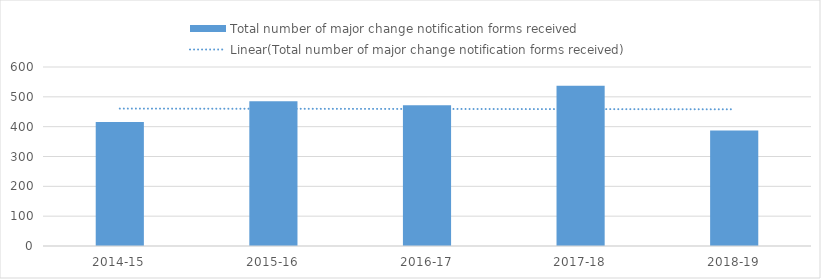
| Category | Total number of major change notification forms received |
|---|---|
| 2014-15 | 416 |
| 2015-16 | 485 |
| 2016-17 | 472 |
| 2017-18 | 537 |
| 2018-19 | 387 |